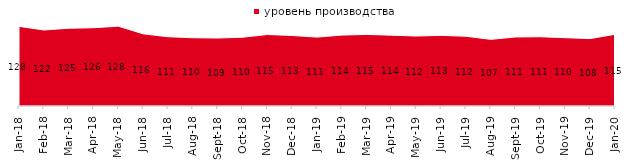
| Category | уровень производства |
|---|---|
| 2018-01-01 | 127.8 |
| 2018-02-01 | 121.95 |
| 2018-03-01 | 124.8 |
| 2018-04-01 | 125.6 |
| 2018-05-01 | 128.1 |
| 2018-06-01 | 115.8 |
| 2018-07-01 | 111.15 |
| 2018-08-01 | 109.55 |
| 2018-09-01 | 109.1 |
| 2018-10-01 | 110.35 |
| 2018-11-01 | 114.721 |
| 2018-12-01 | 113.1 |
| 2019-01-01 | 110.55 |
| 2019-02-01 | 113.8 |
| 2019-03-01 | 114.868 |
| 2019-04-01 | 113.663 |
| 2019-05-01 | 112.283 |
| 2019-06-01 | 113.367 |
| 2019-07-01 | 111.881 |
| 2019-08-01 | 106.943 |
| 2019-09-01 | 110.792 |
| 2019-10-01 | 111.139 |
| 2019-11-01 | 109.604 |
| 2019-12-01 | 108.218 |
| 2020-01-01 | 115 |